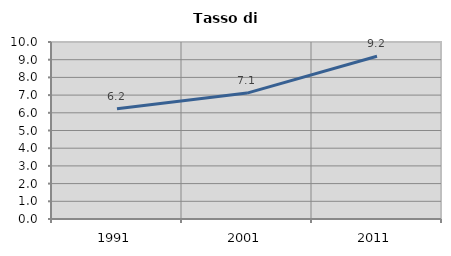
| Category | Tasso di disoccupazione   |
|---|---|
| 1991.0 | 6.227 |
| 2001.0 | 7.115 |
| 2011.0 | 9.195 |